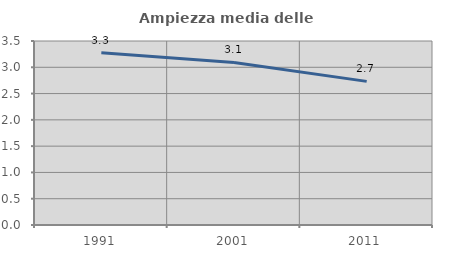
| Category | Ampiezza media delle famiglie |
|---|---|
| 1991.0 | 3.279 |
| 2001.0 | 3.092 |
| 2011.0 | 2.732 |